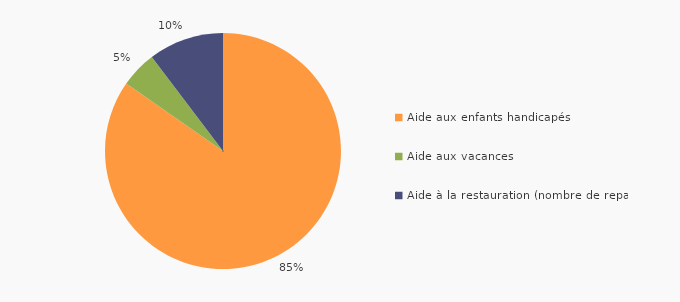
| Category | Figure 10.2 - Répartition des prestations interministérielles (tous programmes) par type, en 2015 |
|---|---|
| Aide aux enfants handicapés | 0.847 |
| Aide aux vacances | 0.05 |
| Aide à la restauration (nombre de repas) | 0.103 |